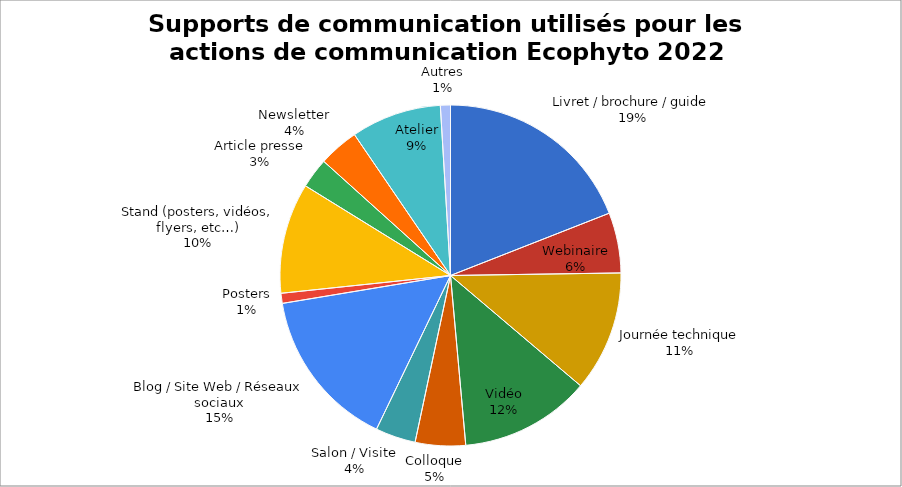
| Category | Supports de communication utilisés pour les actions de communication Ecophyto 2022 |
|---|---|
| Livret / brochure / guide | 20 |
| Webinaire | 6 |
| Journée technique | 12 |
| Vidéo | 13 |
| Colloque | 5 |
| Salon / Visite | 4 |
| Blog / Site Web / Réseaux sociaux | 16 |
| Posters | 1 |
| Stand (posters, vidéos, flyers, etc…) | 11 |
| Article presse | 3 |
| Newsletter | 4 |
| Atelier | 9 |
| Autres | 1 |